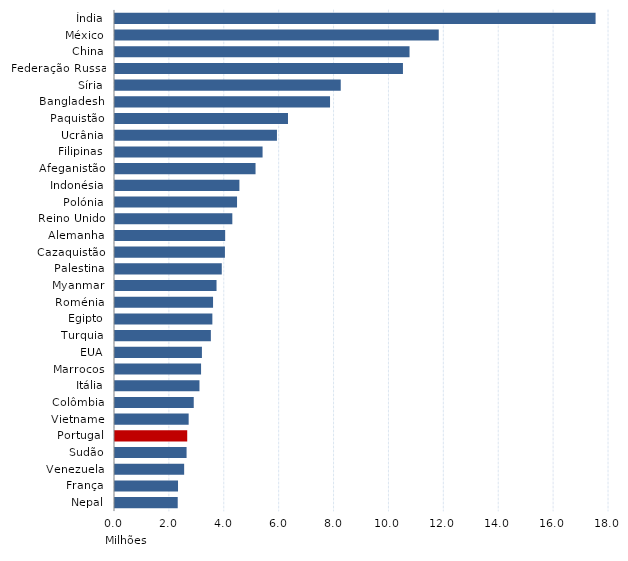
| Category | Series 0 |
|---|---|
| Índia | 17.511 |
| México | 11.796 |
| China | 10.732 |
| Federação Russa | 10.492 |
| Síria | 8.225 |
| Bangladesh | 7.835 |
| Paquistão | 6.303 |
| Ucrânia | 5.901 |
| Filipinas | 5.377 |
| Afeganistão | 5.121 |
| Indonésia | 4.533 |
| Polónia | 4.447 |
| Reino Unido | 4.275 |
| Alemanha | 4.014 |
| Cazaquistão | 4.006 |
| Palestina | 3.891 |
| Myanmar | 3.699 |
| Roménia | 3.573 |
| Egipto | 3.548 |
| Turquia | 3.493 |
| EUA | 3.167 |
| Marrocos | 3.136 |
| Itália | 3.078 |
| Colômbia | 2.869 |
| Vietname | 2.684 |
| Portugal | 2.632 |
| Sudão | 2.608 |
| Venezuela | 2.52 |
| França | 2.297 |
| Nepal | 2.285 |